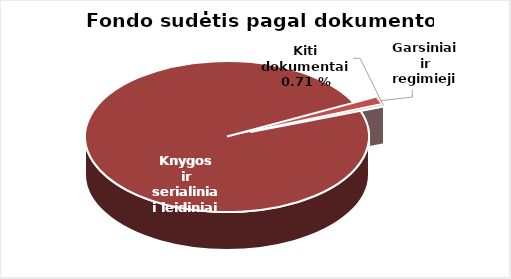
| Category | Series 0 |
|---|---|
| Knygos ir serialiniai | 939440 |
| Garsiniai ir regimieji | 14149 |
| Kiti dokumentai | 3433 |